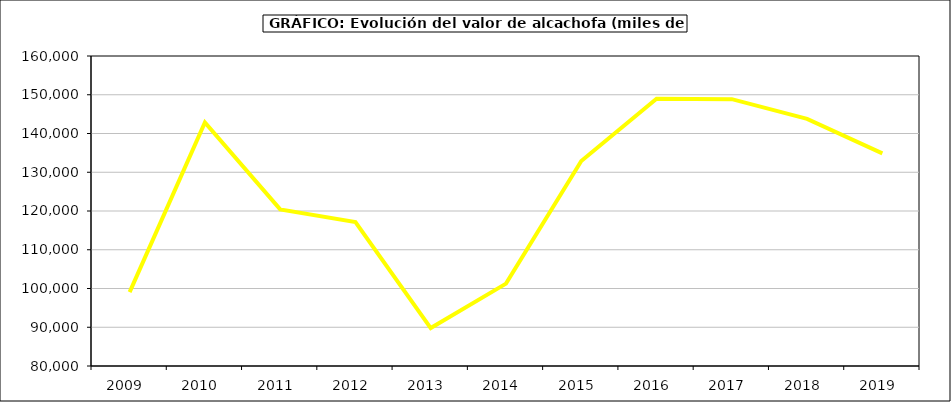
| Category | Valor |
|---|---|
| 2009.0 | 99068.13 |
| 2010.0 | 142879.333 |
| 2011.0 | 120418 |
| 2012.0 | 117146.597 |
| 2013.0 | 89795.299 |
| 2014.0 | 101254.898 |
| 2015.0 | 132897 |
| 2016.0 | 148974 |
| 2017.0 | 148863.365 |
| 2018.0 | 143776.931 |
| 2019.0 | 134882.222 |